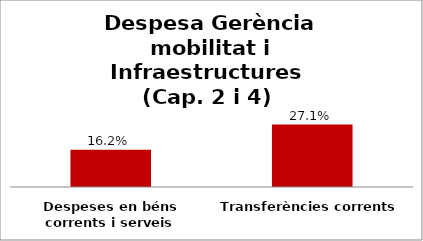
| Category | Series 0 |
|---|---|
| Despeses en béns corrents i serveis | 0.162 |
| Transferències corrents | 0.271 |